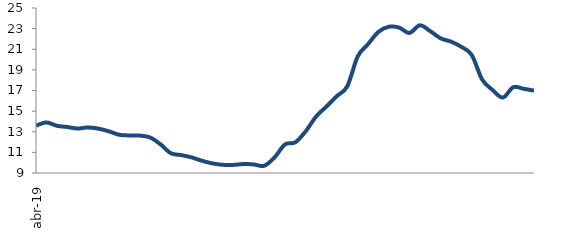
| Category | Series 0 |
|---|---|
| 2019-04-01 | 13.585 |
| 2019-05-01 | 13.903 |
| 2019-06-01 | 13.582 |
| 2019-07-01 | 13.459 |
| 2019-08-01 | 13.315 |
| 2019-09-01 | 13.417 |
| 2019-10-01 | 13.304 |
| 2019-11-01 | 13.05 |
| 2019-12-01 | 12.71 |
| 2020-01-01 | 12.642 |
| 2020-02-01 | 12.627 |
| 2020-03-01 | 12.445 |
| 2020-04-01 | 11.784 |
| 2020-05-01 | 10.914 |
| 2020-06-01 | 10.736 |
| 2020-07-01 | 10.514 |
| 2020-08-01 | 10.182 |
| 2020-09-01 | 9.933 |
| 2020-10-01 | 9.795 |
| 2020-11-01 | 9.783 |
| 2020-12-01 | 9.869 |
| 2021-01-01 | 9.83 |
| 2021-02-01 | 9.703 |
| 2021-03-01 | 10.521 |
| 2021-04-01 | 11.773 |
| 2021-05-01 | 11.98 |
| 2021-06-01 | 13.052 |
| 2021-07-01 | 14.478 |
| 2021-08-01 | 15.452 |
| 2021-09-01 | 16.459 |
| 2021-10-01 | 17.401 |
| 2021-11-01 | 20.289 |
| 2021-12-01 | 21.495 |
| 2022-01-01 | 22.678 |
| 2022-02-01 | 23.183 |
| 2022-03-01 | 23.098 |
| 2022-04-01 | 22.584 |
| 2022-05-01 | 23.32 |
| 2022-06-01 | 22.755 |
| 2022-07-01 | 22.06 |
| 2022-08-01 | 21.737 |
| 2022-09-01 | 21.232 |
| 2022-10-01 | 20.439 |
| 2022-11-01 | 18.065 |
| 2022-12-01 | 17.057 |
| 2023-01-01 | 16.316 |
| 2023-02-01 | 17.317 |
| 2023-03-01 | 17.168 |
| 2023-04-01 | 16.986 |